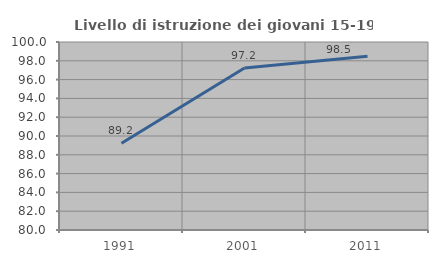
| Category | Livello di istruzione dei giovani 15-19 anni |
|---|---|
| 1991.0 | 89.23 |
| 2001.0 | 97.233 |
| 2011.0 | 98.496 |